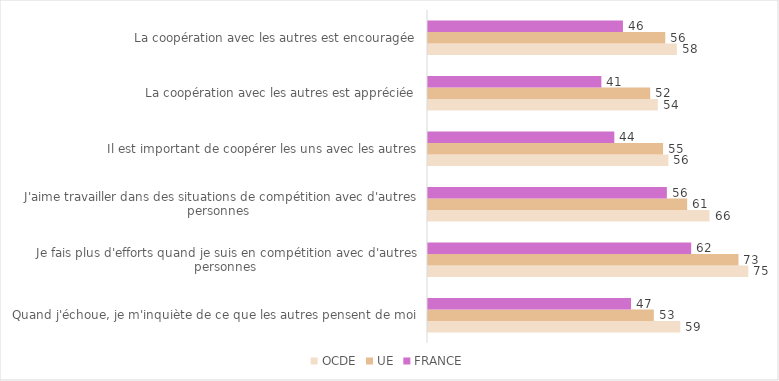
| Category | OCDE | UE | FRANCE |
|---|---|---|---|
| Quand j'échoue, je m'inquiète de ce que les autres pensent de moi | 59.017 | 52.826 | 47.49 |
|  Je fais plus d'efforts quand je suis en compétition avec d'autres personnes | 74.92 | 72.623 | 61.562 |
|  J'aime travailler dans des situations de compétition avec d'autres personnes | 65.854 | 60.624 | 55.874 |
| Il est important de coopérer les uns avec les autres | 56.245 | 54.977 | 43.584 |
| La coopération avec les autres est appréciée | 53.766 | 51.982 | 40.557 |
| La coopération avec les autres est encouragée | 58.217 | 55.502 | 45.6 |